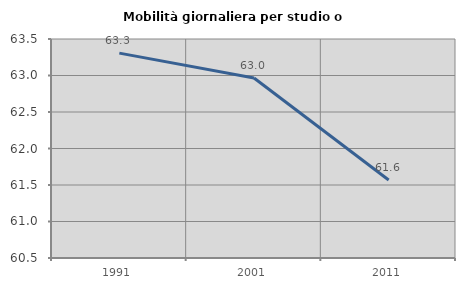
| Category | Mobilità giornaliera per studio o lavoro |
|---|---|
| 1991.0 | 63.307 |
| 2001.0 | 62.967 |
| 2011.0 | 61.569 |